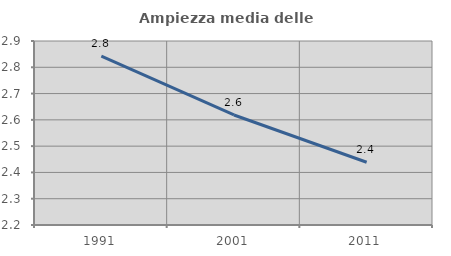
| Category | Ampiezza media delle famiglie |
|---|---|
| 1991.0 | 2.843 |
| 2001.0 | 2.619 |
| 2011.0 | 2.439 |